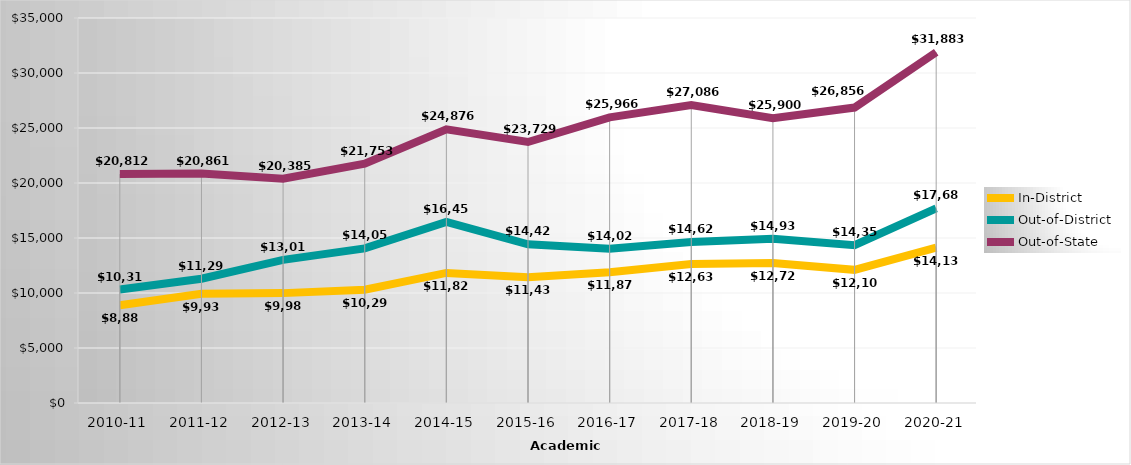
| Category | In-District | Out-of-District | Out-of-State |
|---|---|---|---|
| 2010-11 | 8889 | 10313 | 20812 |
| 2011-12 | 9933.23 | 11297.18 | 20861.23 |
| 2012-13 | 9988.67 | 13011.78 | 20384.67 |
| 2013-14 | 10297.84 | 14057.56 | 21753.28 |
| 2014-15 | 11827.062 | 16453.562 | 24875.688 |
| 2015-16 | 11438 | 14422 | 23729 |
| 2016-17 | 11878 | 14022 | 25966 |
| 2017-18 | 12630 | 14628 | 27086 |
| 2018-19 | 12724 | 14934 | 25900 |
| 2019-20 | 12106 | 14351 | 26856 |
| 2020-21 | 14133 | 17688 | 31883 |